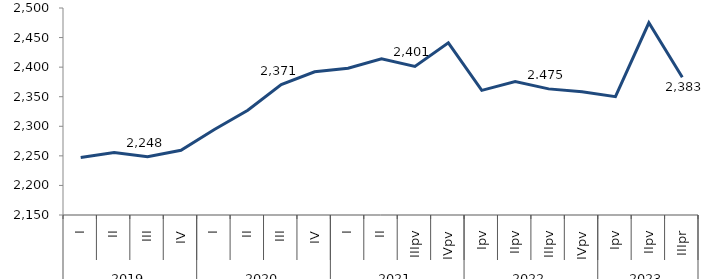
| Category | Series 0 |
|---|---|
| 0 | 2247.095 |
| 1 | 2255.594 |
| 2 | 2248.39 |
| 3 | 2259.472 |
| 4 | 2294.598 |
| 5 | 2327.144 |
| 6 | 2370.6 |
| 7 | 2392.098 |
| 8 | 2398.201 |
| 9 | 2413.932 |
| 10 | 2401.222 |
| 11 | 2441.157 |
| 12 | 2360.788 |
| 13 | 2375.82 |
| 14 | 2363.248 |
| 15 | 2358.48 |
| 16 | 2350 |
| 17 | 2475 |
| 18 | 2383 |